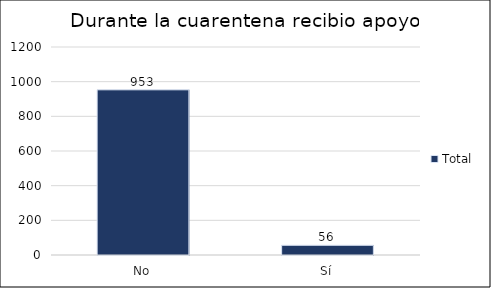
| Category | Total |
|---|---|
| No | 953 |
| Sí | 56 |